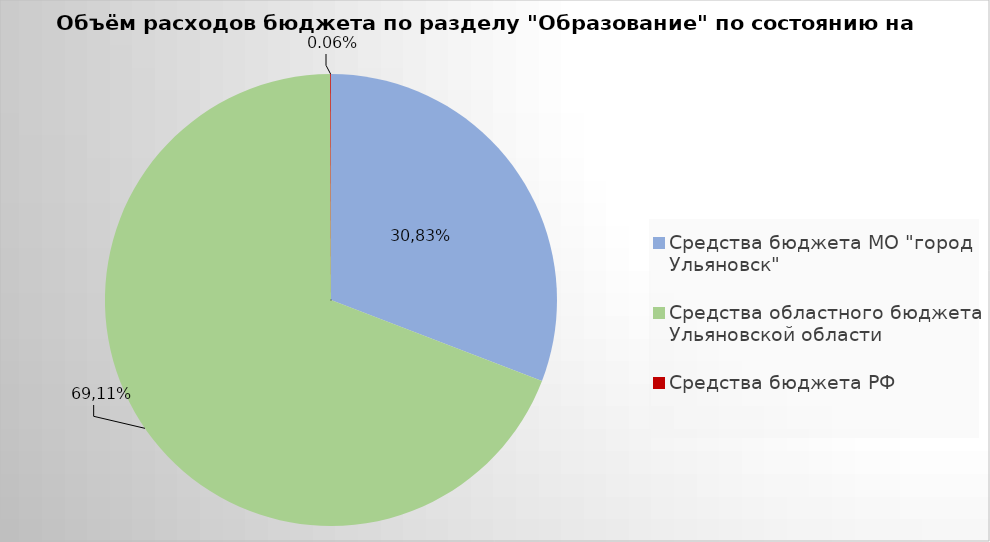
| Category | Series 0 |
|---|---|
| Средства бюджета МО "город Ульяновск" | 1597934.06 |
| Средства областного бюджета Ульяновской области | 3581724.6 |
| Средства бюджета РФ | 2856.34 |